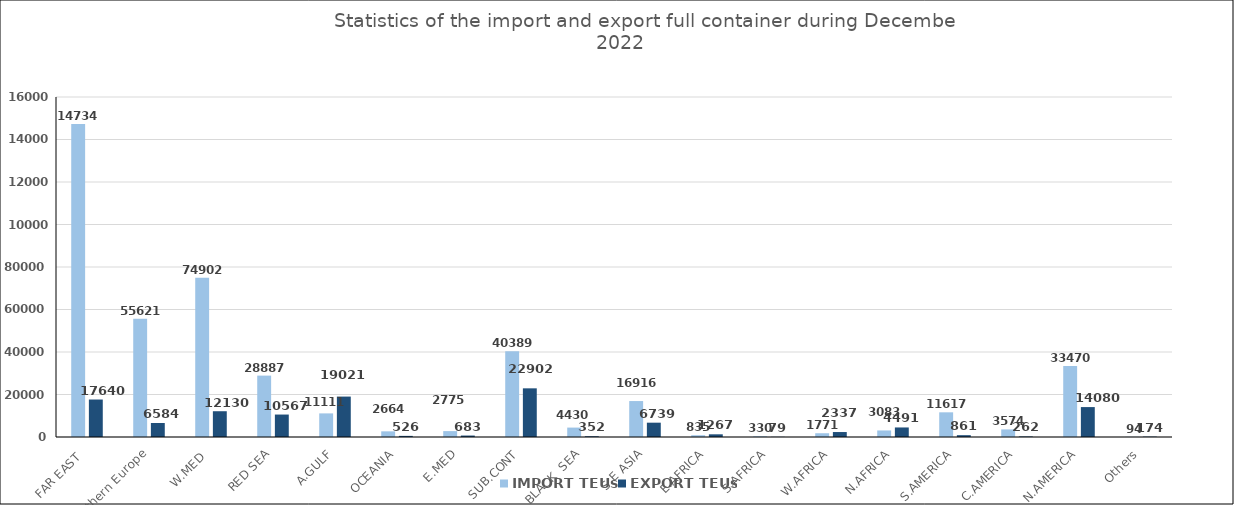
| Category | IMPORT | EXPORT |
|---|---|---|
| FAR EAST  | 147345 | 17640 |
| Northern Europe | 55621 | 6584 |
| W.MED  | 74902 | 12130 |
| RED SEA | 28887 | 10567 |
| A.GULF | 11111 | 19021 |
| OCEANIA | 2664 | 526 |
| E.MED | 2775 | 683 |
| SUB.CONT | 40389 | 22902 |
| BLACK  SEA | 4430 | 352 |
| S.E ASIA | 16916 | 6739 |
| E.AFRICA | 835 | 1267 |
| S.AFRICA | 330 | 79 |
| W.AFRICA | 1771 | 2337 |
| N.AFRICA | 3083 | 4491 |
| S.AMERICA | 11617 | 861 |
| C.AMERICA | 3574 | 262 |
| N.AMERICA | 33470 | 14080 |
| Others | 94 | 174 |